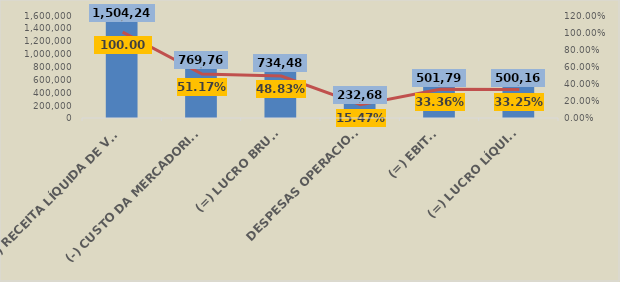
| Category | Em R$ 1 |
|---|---|
| (=) RECEITA LÍQUIDA DE VENDAS | 1504241.468 |
| (-) CUSTO DA MERCADORIA VENDIDA (CMV) | 769760.61 |
| (=) LUCRO BRUTO | 734480.858 |
| DESPESAS OPERACIONAIS | 232683.251 |
| (=) EBITDA | 501797.607 |
| (=) LUCRO LÍQUIDO | 500168.337 |